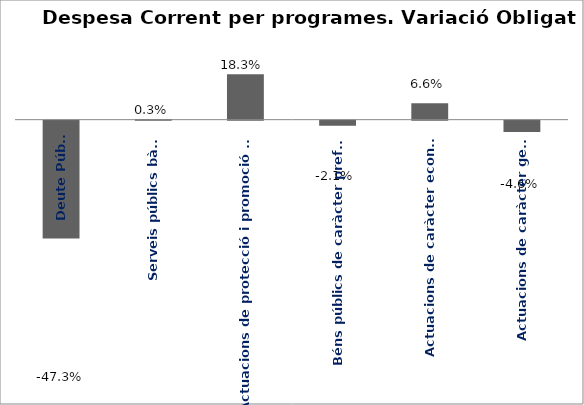
| Category | Series 0 |
|---|---|
| Deute Públic | -0.473 |
| Serveis públics bàsics | 0.003 |
| Actuacions de protecció i promoció social | 0.183 |
| Béns públics de caràcter preferent | -0.021 |
| Actuacions de caràcter econòmic | 0.066 |
| Actuacions de caràcter general | -0.046 |